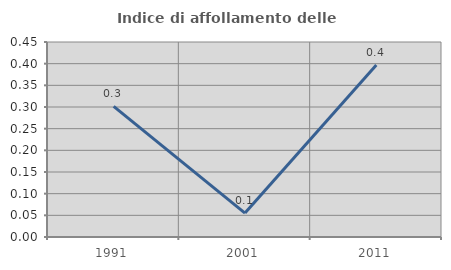
| Category | Indice di affollamento delle abitazioni  |
|---|---|
| 1991.0 | 0.301 |
| 2001.0 | 0.055 |
| 2011.0 | 0.397 |